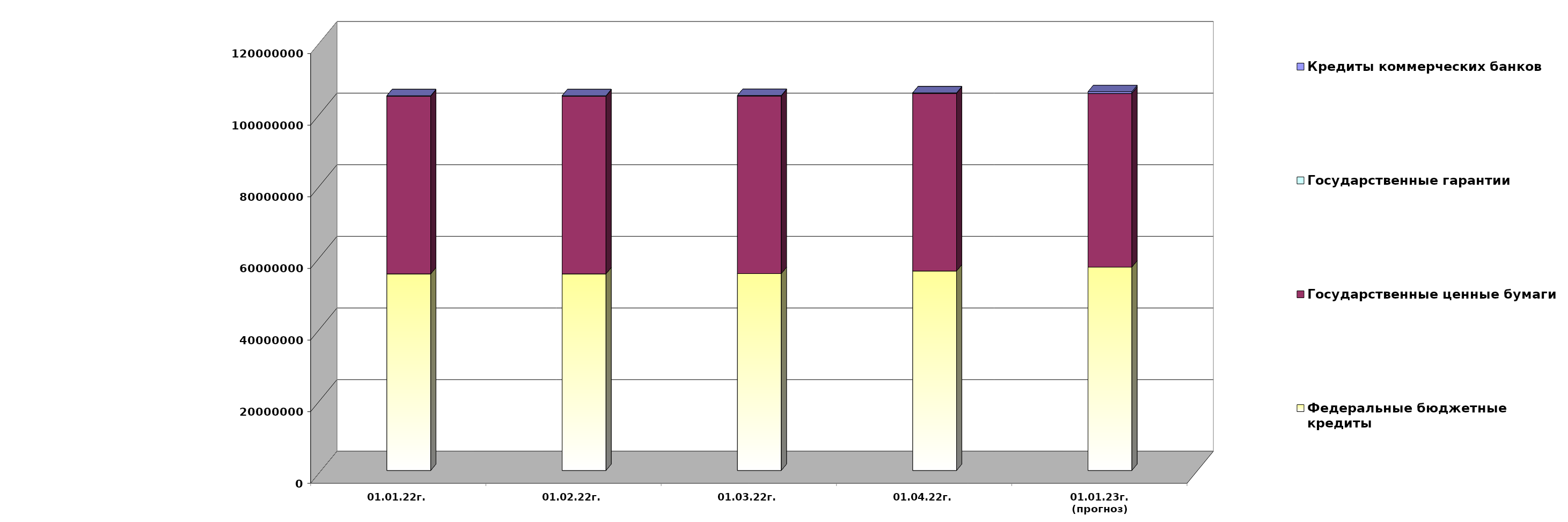
| Category | Федеральные бюджетные кредиты | Государственные ценные бумаги  | Государственные гарантии | Кредиты коммерческих банков |
|---|---|---|---|---|
| 01.01.22г. | 54900618.713 | 49600000 | 141570.67 | 0 |
| 01.02.22г. | 54900618.713 | 49600000 | 139748.87 | 0 |
| 01.03.22г. | 54970753.113 | 49600000 | 139748.87 | 0 |
| 01.04.22г. | 55700753.113 | 49600000 | 139748.87 | 0 |
| 01.01.23г.
(прогноз) | 56784668.3 | 48500000 | 0 | 486329.5 |